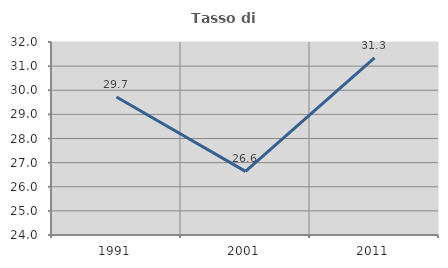
| Category | Tasso di occupazione   |
|---|---|
| 1991.0 | 29.719 |
| 2001.0 | 26.639 |
| 2011.0 | 31.343 |